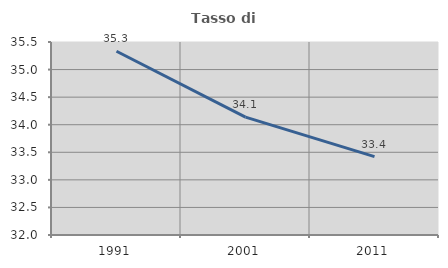
| Category | Tasso di occupazione   |
|---|---|
| 1991.0 | 35.333 |
| 2001.0 | 34.138 |
| 2011.0 | 33.422 |